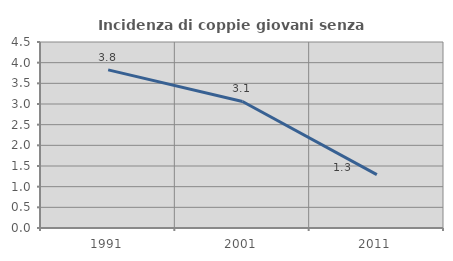
| Category | Incidenza di coppie giovani senza figli |
|---|---|
| 1991.0 | 3.826 |
| 2001.0 | 3.061 |
| 2011.0 | 1.29 |